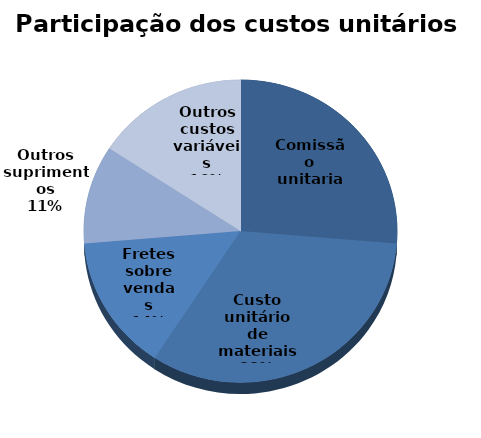
| Category | Series 0 |
|---|---|
| Comissão unitaria | 2 |
| Custo unitário de materiais | 2.5 |
| Fretes sobre vendas | 1.1 |
| Outros suprimentos | 0.8 |
| Outros custos variáveis | 1.2 |